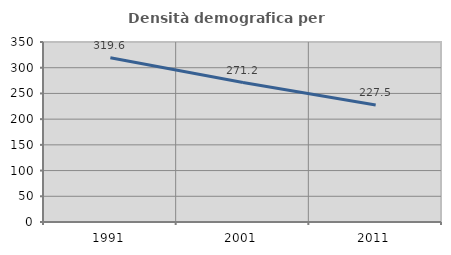
| Category | Densità demografica |
|---|---|
| 1991.0 | 319.557 |
| 2001.0 | 271.24 |
| 2011.0 | 227.485 |